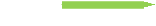
| Category | Makes it easy to share documents |
|---|---|
| Makes it easy to share documents | 3 |